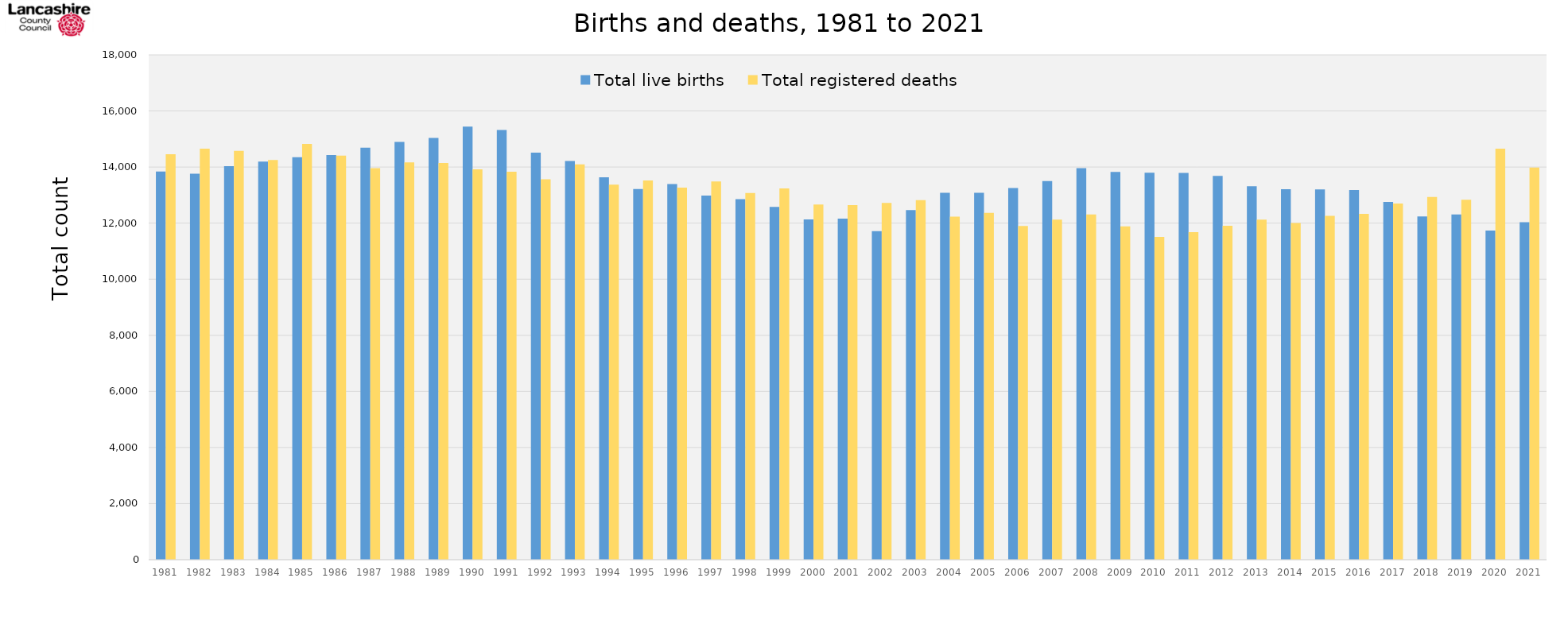
| Category | Total live births | Total registered deaths |
|---|---|---|
| 1981.0 | 13839 | 14458 |
| 1982.0 | 13759 | 14654 |
| 1983.0 | 14030 | 14577 |
| 1984.0 | 14191 | 14248 |
| 1985.0 | 14352 | 14826 |
| 1986.0 | 14425 | 14409 |
| 1987.0 | 14688 | 13961 |
| 1988.0 | 14899 | 14165 |
| 1989.0 | 15037 | 14147 |
| 1990.0 | 15442 | 13917 |
| 1991.0 | 15324 | 13836 |
| 1992.0 | 14510 | 13566 |
| 1993.0 | 14213 | 14094 |
| 1994.0 | 13637 | 13373 |
| 1995.0 | 13215 | 13521 |
| 1996.0 | 13391 | 13265 |
| 1997.0 | 12980 | 13486 |
| 1998.0 | 12856 | 13072 |
| 1999.0 | 12577 | 13235 |
| 2000.0 | 12132 | 12664 |
| 2001.0 | 12164 | 12645 |
| 2002.0 | 11716 | 12721 |
| 2003.0 | 12463 | 12823 |
| 2004.0 | 13082 | 12230 |
| 2005.0 | 13084 | 12364 |
| 2006.0 | 13249 | 11898 |
| 2007.0 | 13503 | 12123 |
| 2008.0 | 13963 | 12306 |
| 2009.0 | 13829 | 11886 |
| 2010.0 | 13797 | 11508 |
| 2011.0 | 13794 | 11676 |
| 2012.0 | 13681 | 11903 |
| 2013.0 | 13317 | 12125 |
| 2014.0 | 13210 | 12002 |
| 2015.0 | 13202 | 12259 |
| 2016.0 | 13183 | 12333 |
| 2017.0 | 12757 | 12697 |
| 2018.0 | 12238 | 12930 |
| 2019.0 | 12306 | 12831 |
| 2020.0 | 11736 | 14652 |
| 2021.0 | 12035 | 13985 |